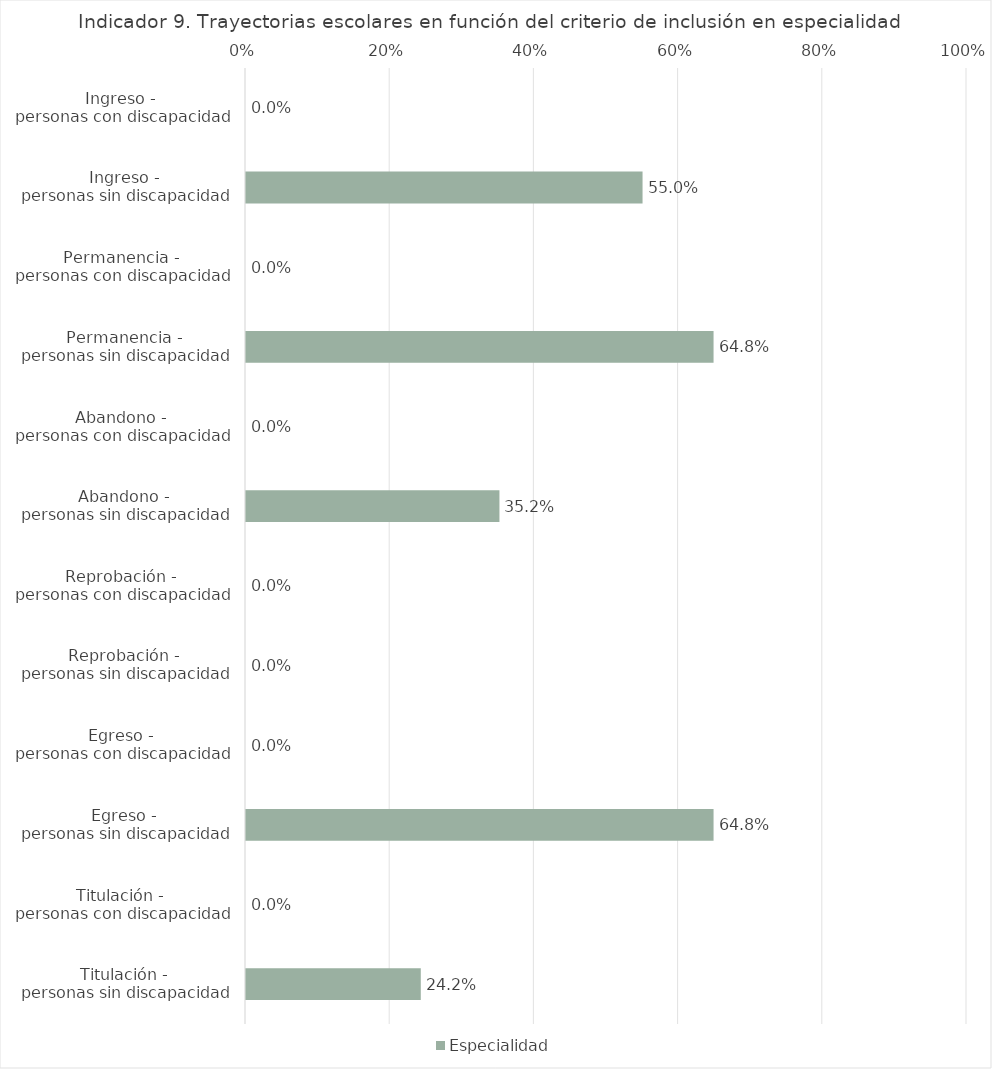
| Category | Especialidad |
|---|---|
| Ingreso - 
personas con discapacidad | 0 |
| Ingreso - 
personas sin discapacidad | 0.55 |
| Permanencia - 
personas con discapacidad | 0 |
| Permanencia - 
personas sin discapacidad | 0.648 |
| Abandono - 
personas con discapacidad | 0 |
| Abandono - 
personas sin discapacidad | 0.352 |
| Reprobación - 
personas con discapacidad | 0 |
| Reprobación - 
personas sin discapacidad | 0 |
| Egreso - 
personas con discapacidad | 0 |
| Egreso - 
personas sin discapacidad | 0.648 |
| Titulación - 
personas con discapacidad | 0 |
| Titulación - 
personas sin discapacidad | 0.242 |